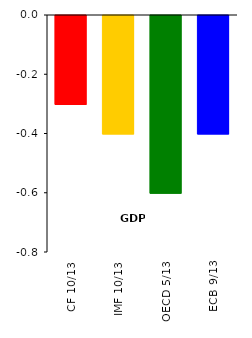
| Category | GDP |
|---|---|
| CF 10/13 | -0.3 |
| IMF 10/13 | -0.4 |
| OECD 5/13 | -0.6 |
| ECB 9/13 | -0.4 |